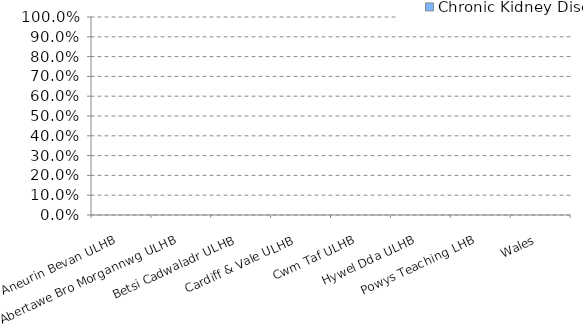
| Category | Chronic Kidney Disease |
|---|---|
| Aneurin Bevan ULHB | 0 |
| Abertawe Bro Morgannwg ULHB | 0 |
| Betsi Cadwaladr ULHB | 0 |
| Cardiff & Vale ULHB | 0 |
| Cwm Taf ULHB | 0 |
| Hywel Dda ULHB | 0 |
| Powys Teaching LHB | 0 |
| Wales | 0 |